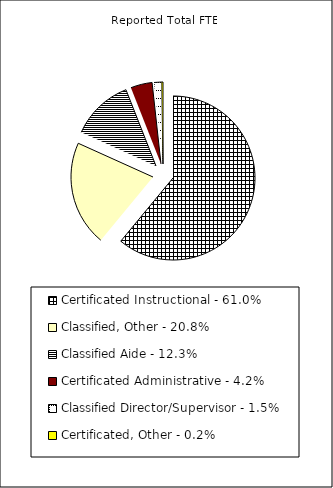
| Category | Reported FTE |
|---|---|
| Certificated Instructional - 61.0% | 72395.95 |
| Classified, Other - 20.8% | 24631.63 |
| Classified Aide - 12.3% | 14573.38 |
| Certificated Administrative - 4.2% | 5028.51 |
| Classified Director/Supervisor - 1.5% | 1782.36 |
| Certificated, Other - 0.2% | 279.99 |